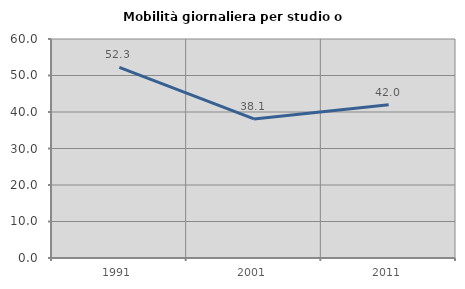
| Category | Mobilità giornaliera per studio o lavoro |
|---|---|
| 1991.0 | 52.251 |
| 2001.0 | 38.092 |
| 2011.0 | 41.995 |